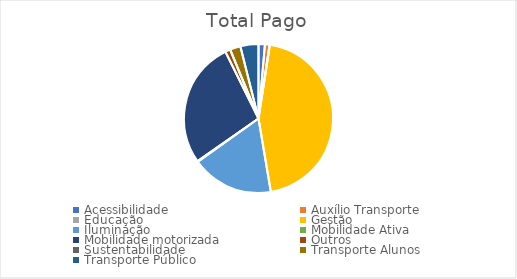
| Category | Soma de valor_pago |
|---|---|
| Acessibilidade | 6283429.06 |
| Auxílio Transporte | 4472854.57 |
| Educação | 357640 |
| Gestão | 204558920.92 |
| Iluminação | 81041707.18 |
| Mobilidade Ativa | 690236.97 |
| Mobilidade motorizada | 124707028.19 |
| Outros | 5070428.54 |
| Sustentabilidade | 0 |
| Transporte Alunos | 10453789.2 |
| Transporte Público | 17880411.94 |